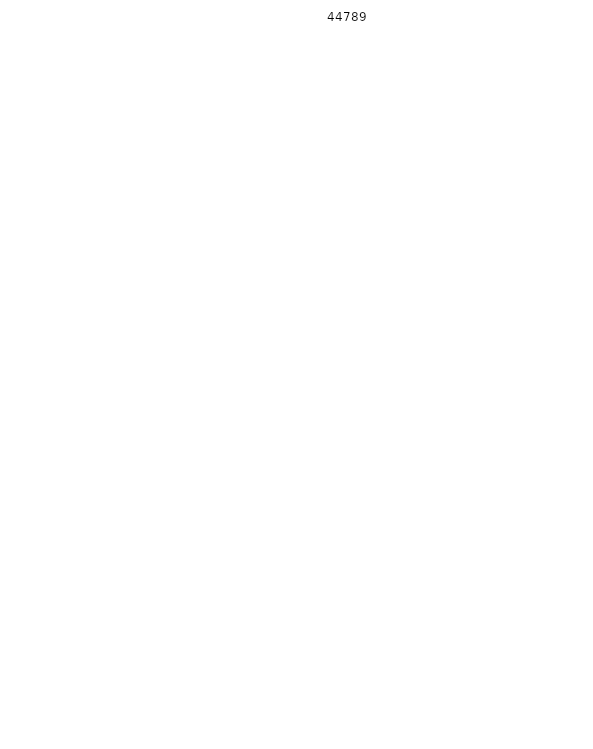
| Category | Series 2 |
|---|---|
| 0 | 0 |
| 1 | 0 |
| 2 | 0 |
| 3 | 0 |
| 4 | 0 |